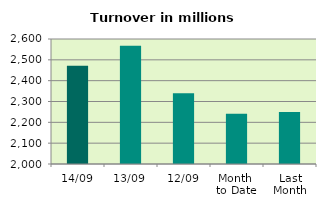
| Category | Series 0 |
|---|---|
| 14/09 | 2472.111 |
| 13/09 | 2567.683 |
| 12/09 | 2339.698 |
| Month 
to Date | 2241.303 |
| Last
Month | 2249.305 |